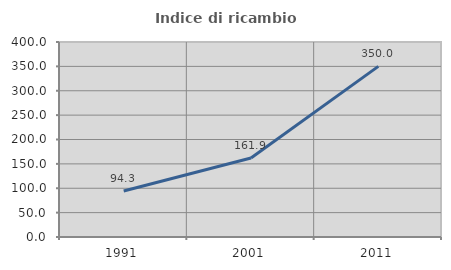
| Category | Indice di ricambio occupazionale  |
|---|---|
| 1991.0 | 94.286 |
| 2001.0 | 161.905 |
| 2011.0 | 350 |